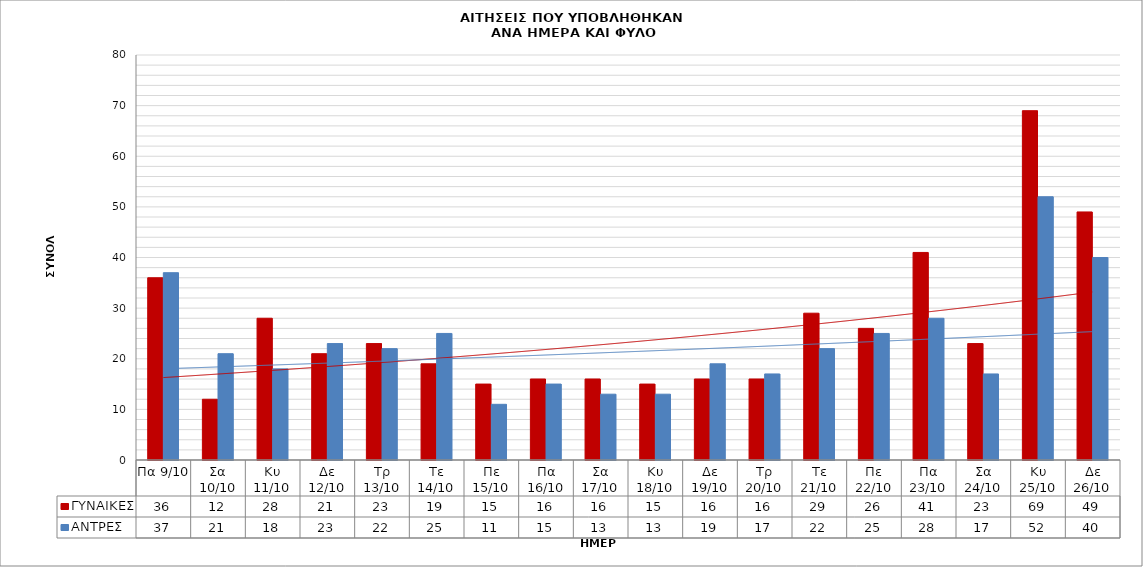
| Category | ΓΥΝΑΙΚΕΣ | ΑΝΤΡΕΣ |
|---|---|---|
| Πα 9/10 | 36 | 37 |
| Σα 10/10 | 12 | 21 |
| Κυ 11/10 | 28 | 18 |
| Δε 12/10 | 21 | 23 |
| Τρ 13/10 | 23 | 22 |
| Τε 14/10 | 19 | 25 |
| Πε 15/10 | 15 | 11 |
| Πα 16/10 | 16 | 15 |
| Σα 17/10 | 16 | 13 |
| Κυ 18/10 | 15 | 13 |
| Δε 19/10 | 16 | 19 |
| Τρ 20/10 | 16 | 17 |
| Τε 21/10 | 29 | 22 |
| Πε 22/10 | 26 | 25 |
| Πα 23/10 | 41 | 28 |
| Σα 24/10 | 23 | 17 |
| Κυ 25/10 | 69 | 52 |
| Δε 26/10 | 49 | 40 |